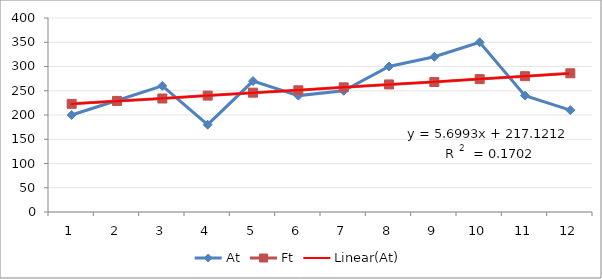
| Category | At | Ft |
|---|---|---|
| 0 | 200 | 223 |
| 1 | 230 | 229 |
| 2 | 260 | 234 |
| 3 | 180 | 240 |
| 4 | 270 | 246 |
| 5 | 240 | 251 |
| 6 | 250 | 257 |
| 7 | 300 | 263 |
| 8 | 320 | 268 |
| 9 | 350 | 274 |
| 10 | 240 | 280 |
| 11 | 210 | 286 |